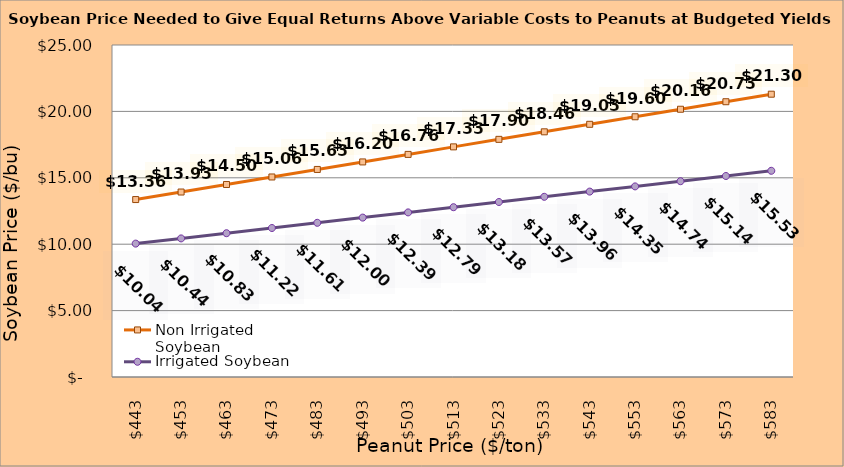
| Category | Non Irrigated Soybean | Irrigated Soybean |
|---|---|---|
| 442.5 | 13.362 | 10.044 |
| 452.5 | 13.929 | 10.436 |
| 462.5 | 14.496 | 10.828 |
| 472.5 | 15.062 | 11.219 |
| 482.5 | 15.629 | 11.611 |
| 492.5 | 16.196 | 12.003 |
| 502.5 | 16.762 | 12.394 |
| 512.5 | 17.329 | 12.786 |
| 522.5 | 17.896 | 13.178 |
| 532.5 | 18.462 | 13.569 |
| 542.5 | 19.029 | 13.961 |
| 552.5 | 19.596 | 14.353 |
| 562.5 | 20.162 | 14.744 |
| 572.5 | 20.729 | 15.136 |
| 582.5 | 21.296 | 15.528 |